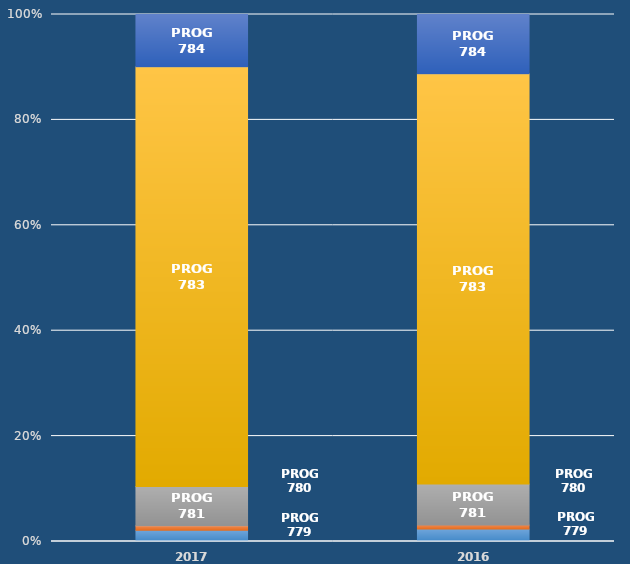
| Category | PROG 779 | PROG 780 | PROG 781 | PROG 783 | PROG 784 |
|---|---|---|---|---|---|
| 2017.0 | 0.021 | 0.009 | 0.074 | 0.797 | 0.099 |
| 2016.0 | 0.024 | 0.007 | 0.078 | 0.778 | 0.113 |